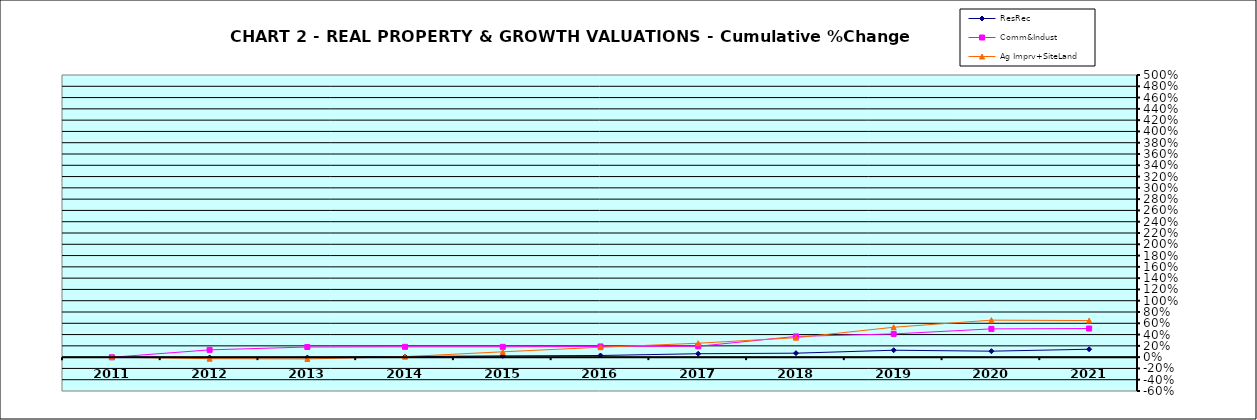
| Category | ResRec | Comm&Indust | Ag Imprv+SiteLand |
|---|---|---|---|
| 2011.0 | 0 | -0.002 | 0 |
| 2012.0 | -0.007 | 0.129 | -0.027 |
| 2013.0 | -0.007 | 0.179 | -0.032 |
| 2014.0 | 0.011 | 0.183 | 0.009 |
| 2015.0 | 0.022 | 0.183 | 0.095 |
| 2016.0 | 0.029 | 0.19 | 0.175 |
| 2017.0 | 0.06 | 0.192 | 0.247 |
| 2018.0 | 0.07 | 0.367 | 0.345 |
| 2019.0 | 0.123 | 0.412 | 0.53 |
| 2020.0 | 0.106 | 0.501 | 0.656 |
| 2021.0 | 0.14 | 0.508 | 0.648 |